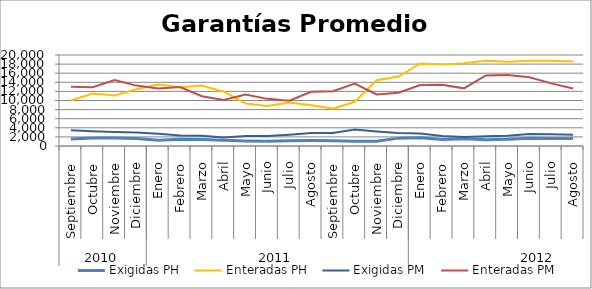
| Category | Exigidas PH | Enteradas PH | Exigidas PM | Enteradas PM |
|---|---|---|---|---|
| 0 | 1528.048 | 9989.528 | 3482.397 | 13040.893 |
| 1 | 1765.671 | 11522.563 | 3249.678 | 12931.878 |
| 2 | 1744.818 | 11123.372 | 3083.204 | 14519.409 |
| 3 | 1659.203 | 12493.623 | 2971.808 | 13273.812 |
| 4 | 1282.931 | 13511.197 | 2715.795 | 12631.271 |
| 5 | 1469.886 | 12912.935 | 2313.398 | 12967.84 |
| 6 | 1451.049 | 13292.147 | 2234.5 | 10944.124 |
| 7 | 1243.266 | 11940.059 | 1876.192 | 10106.188 |
| 8 | 1094.477 | 9346.935 | 2211.516 | 11309.35 |
| 9 | 1038.181 | 8772.488 | 2185.859 | 10360.845 |
| 10 | 1150.33 | 9583.522 | 2484.933 | 9954.534 |
| 11 | 1204.945 | 8947.225 | 2874.347 | 11912.953 |
| 12 | 1181.135 | 8218.837 | 2868.226 | 12046.458 |
| 13 | 1047.181 | 9725.758 | 3619.145 | 13704.352 |
| 14 | 1067.214 | 14456.861 | 3177.175 | 11327.495 |
| 15 | 1729.716 | 15271.717 | 2830.669 | 11719.895 |
| 16 | 1828.564 | 18155.583 | 2744.93 | 13413.991 |
| 17 | 1451.155 | 17917.734 | 2215.902 | 13440.832 |
| 18 | 1587.31 | 18166.129 | 1968.766 | 12673.714 |
| 19 | 1353.003 | 18741.256 | 2118.782 | 15515.723 |
| 20 | 1464.668 | 18540.927 | 2278.002 | 15625.393 |
| 21 | 1719.43 | 18734.539 | 2626.915 | 15127.903 |
| 22 | 1674.023 | 18761.463 | 2556.575 | 13766.49 |
| 23 | 1647.243 | 18544.546 | 2463.76 | 12637.427 |